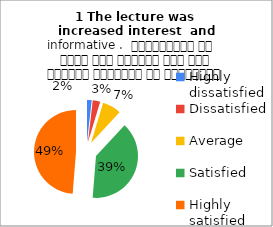
| Category | 1 The lecture was  increased interest  and informative .  व्याख्यान से रुचि में वृद्धि हुई एवं शिक्षण जानकारी से परिपूर्ण था |
|---|---|
| Highly dissatisfied | 5 |
| Dissatisfied | 8 |
| Average | 20 |
| Satisfied | 109 |
| Highly satisfied | 135 |